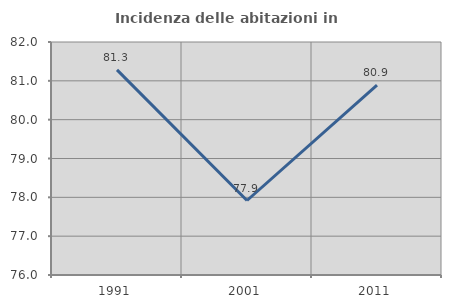
| Category | Incidenza delle abitazioni in proprietà  |
|---|---|
| 1991.0 | 81.283 |
| 2001.0 | 77.918 |
| 2011.0 | 80.891 |